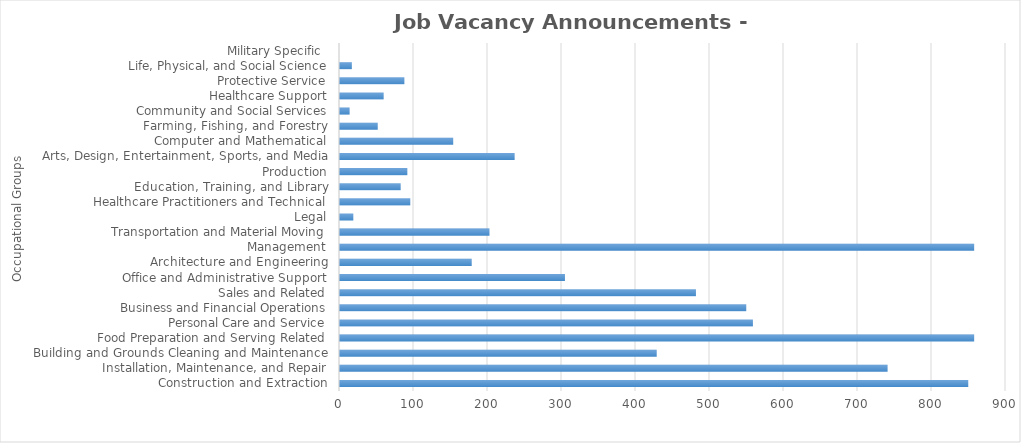
| Category | Total JVAs |
|---|---|
| Construction and Extraction | 849 |
| Installation, Maintenance, and Repair | 740 |
| Building and Grounds Cleaning and Maintenance | 428 |
| Food Preparation and Serving Related | 857 |
| Personal Care and Service | 558 |
| Business and Financial Operations | 549 |
| Sales and Related | 481 |
| Office and Administrative Support | 304 |
| Architecture and Engineering | 178 |
| Management | 857 |
| Transportation and Material Moving | 202 |
| Legal | 18 |
| Healthcare Practitioners and Technical | 95 |
| Education, Training, and Library | 82 |
| Production | 91 |
| Arts, Design, Entertainment, Sports, and Media | 236 |
| Computer and Mathematical | 153 |
| Farming, Fishing, and Forestry | 51 |
| Community and Social Services | 13 |
| Healthcare Support | 59 |
| Protective Service | 87 |
| Life, Physical, and Social Science | 16 |
| Military Specific  | 0 |